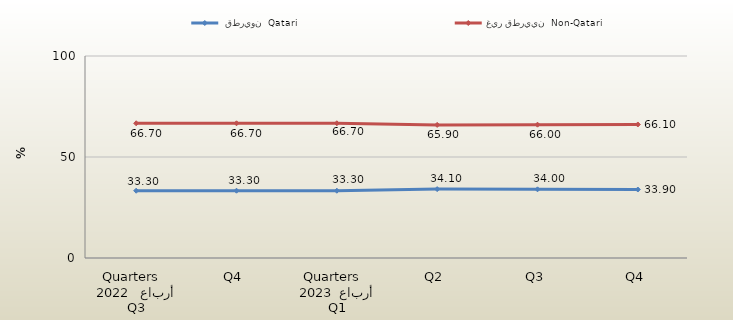
| Category |   قطريون  Qatari  |  غير قطريين  Non-Qatari  |
|---|---|---|
| 0 | 33.3 | 66.7 |
| 1 | 33.3 | 66.7 |
| 2 | 33.3 | 66.7 |
| 3 | 34.1 | 65.9 |
| 4 | 34 | 66 |
| 5 | 33.9 | 66.1 |